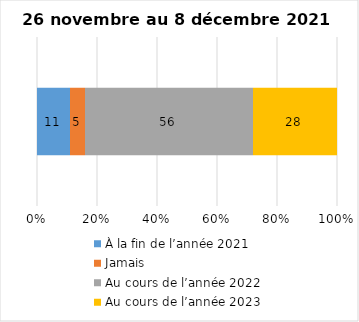
| Category | À la fin de l’année 2021 | Jamais | Au cours de l’année 2022 | Au cours de l’année 2023 |
|---|---|---|---|---|
| 0 | 11 | 5 | 56 | 28 |